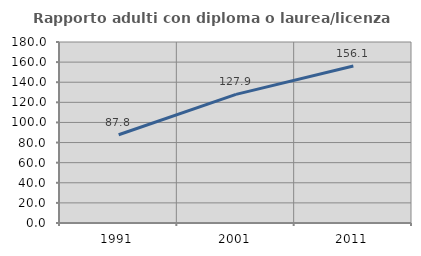
| Category | Rapporto adulti con diploma o laurea/licenza media  |
|---|---|
| 1991.0 | 87.77 |
| 2001.0 | 127.919 |
| 2011.0 | 156.054 |